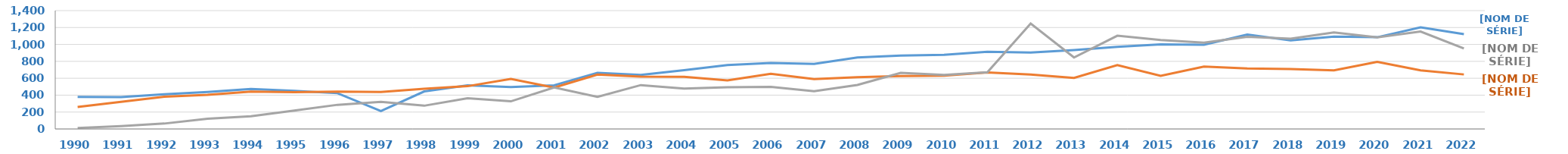
| Category | Bac. Général | Bac. Technologique | Bac. Professionnel |
|---|---|---|---|
| 1990.0 | 379 | 261 | 12 |
| 1991.0 | 376 | 320 | 34 |
| 1992.0 | 411 | 382 | 64 |
| 1993.0 | 437 | 403 | 121 |
| 1994.0 | 474 | 442 | 151 |
| 1995.0 | 451 | 435 | 218 |
| 1996.0 | 423 | 443 | 286 |
| 1997.0 | 213 | 438 | 321 |
| 1998.0 | 444 | 475 | 275 |
| 1999.0 | 516 | 506 | 363 |
| 2000.0 | 495 | 592 | 327 |
| 2001.0 | 516 | 489 | 490 |
| 2002.0 | 665 | 644 | 379 |
| 2003.0 | 639 | 620 | 519 |
| 2004.0 | 695 | 618 | 478 |
| 2005.0 | 756 | 575 | 494 |
| 2006.0 | 781 | 652 | 497 |
| 2007.0 | 770 | 590 | 446 |
| 2008.0 | 845 | 612 | 521 |
| 2009.0 | 868 | 625 | 664 |
| 2010.0 | 878 | 631 | 639 |
| 2011.0 | 914 | 668 | 671 |
| 2012.0 | 904 | 644 | 1247 |
| 2013.0 | 933 | 604 | 846 |
| 2014.0 | 972 | 756 | 1103 |
| 2015.0 | 1001 | 629 | 1052 |
| 2016.0 | 996 | 738 | 1020 |
| 2017.0 | 1117 | 715 | 1091 |
| 2018.0 | 1048 | 709 | 1069 |
| 2019.0 | 1092 | 694 | 1141 |
| 2020.0 | 1085 | 795 | 1084 |
| 2021.0 | 1202 | 694 | 1153 |
| 2022.0 | 1122 | 645 | 952 |